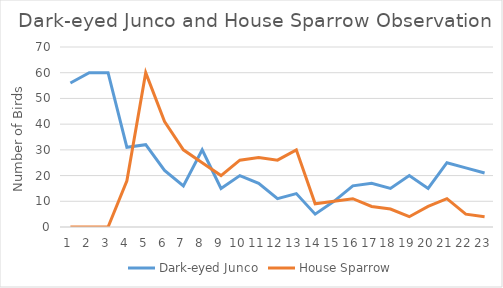
| Category | Dark-eyed Junco | House Sparrow  |
|---|---|---|
| 0 | 56 | 0 |
| 1 | 60 | 0 |
| 2 | 60 | 0 |
| 3 | 31 | 18 |
| 4 | 32 | 60 |
| 5 | 22 | 41 |
| 6 | 16 | 30 |
| 7 | 30 | 25 |
| 8 | 15 | 20 |
| 9 | 20 | 26 |
| 10 | 17 | 27 |
| 11 | 11 | 26 |
| 12 | 13 | 30 |
| 13 | 5 | 9 |
| 14 | 10 | 10 |
| 15 | 16 | 11 |
| 16 | 17 | 8 |
| 17 | 15 | 7 |
| 18 | 20 | 4 |
| 19 | 15 | 8 |
| 20 | 25 | 11 |
| 21 | 23 | 5 |
| 22 | 21 | 4 |